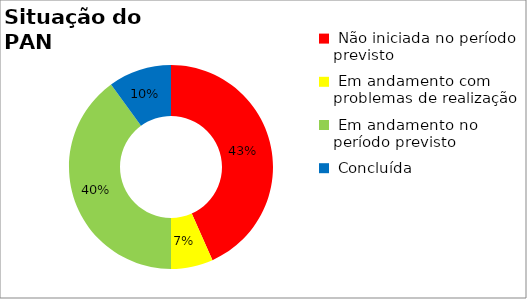
| Category | Series 0 |
|---|---|
|  Início planejado é posterior ao período monitorado | 0 |
|  Não iniciada no período previsto | 0.433 |
|  Em andamento com problemas de realização | 0.067 |
|  Em andamento no período previsto  | 0.4 |
|  Concluída | 0.1 |
|  Ações Novas - Pós monitoria | 0 |